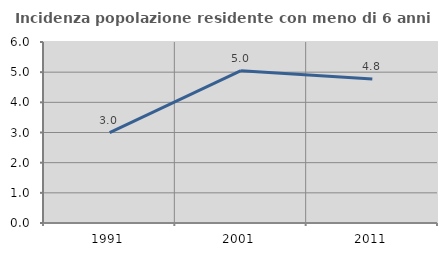
| Category | Incidenza popolazione residente con meno di 6 anni |
|---|---|
| 1991.0 | 2.999 |
| 2001.0 | 5.049 |
| 2011.0 | 4.772 |